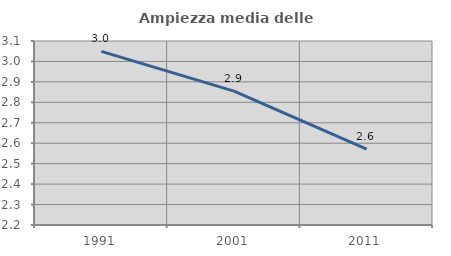
| Category | Ampiezza media delle famiglie |
|---|---|
| 1991.0 | 3.05 |
| 2001.0 | 2.855 |
| 2011.0 | 2.571 |